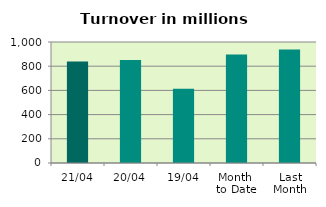
| Category | Series 0 |
|---|---|
| 21/04 | 839.161 |
| 20/04 | 850.783 |
| 19/04 | 613.615 |
| Month 
to Date | 897.13 |
| Last
Month | 937.305 |